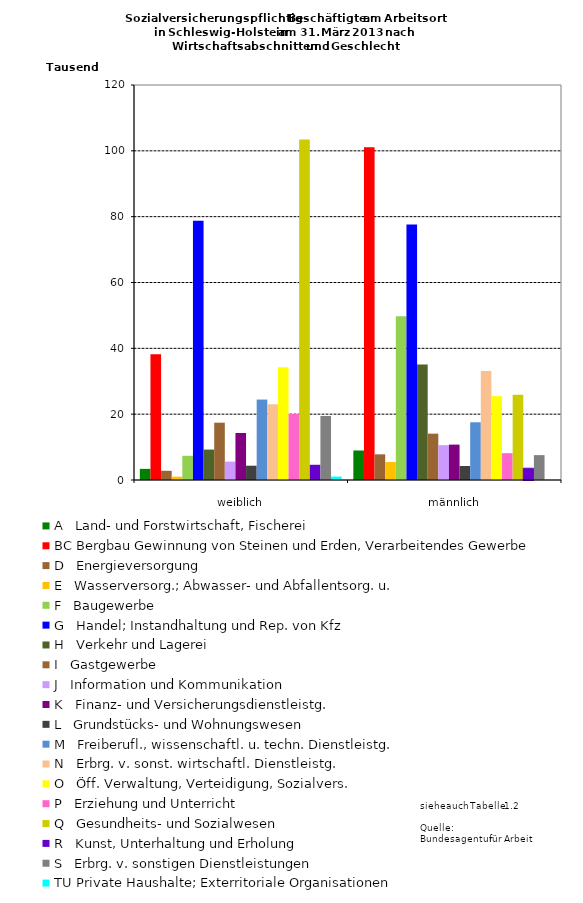
| Category | A   Land- und Forstwirtschaft, Fischerei | BC Bergbau Gewinnung von Steinen und Erden, Verarbeitendes Gewerbe | D   Energieversorgung | E   Wasserversorg.; Abwasser- und Abfallentsorg. u. | F   Baugewerbe | G   Handel; Instandhaltung und Rep. von Kfz | H   Verkehr und Lagerei | I   Gastgewerbe | J   Information und Kommunikation | K   Finanz- und Versicherungsdienstleistg. | L   Grundstücks- und Wohnungswesen | M   Freiberufl., wissenschaftl. u. techn. Dienstleistg. | N   Erbrg. v. sonst. wirtschaftl. Dienstleistg. | O   Öff. Verwaltung, Verteidigung, Sozialvers. | P   Erziehung und Unterricht | Q   Gesundheits- und Sozialwesen | R   Kunst, Unterhaltung und Erholung | S   Erbrg. v. sonstigen Dienstleistungen | TU Private Haushalte; Exterritoriale Organisationen |
|---|---|---|---|---|---|---|---|---|---|---|---|---|---|---|---|---|---|---|---|
| weiblich | 3380 | 38197 | 2799 | 1018 | 7360 | 78778 | 9244 | 17411 | 5588 | 14286 | 4342 | 24441 | 22999 | 34235 | 20050 | 103427 | 4624 | 19442 | 1038 |
| männlich | 8965 | 101051 | 7802 | 5447 | 49723 | 77586 | 35053 | 14082 | 10590 | 10749 | 4252 | 17541 | 33119 | 25480 | 8145 | 25890 | 3574 | 7560 | 210 |